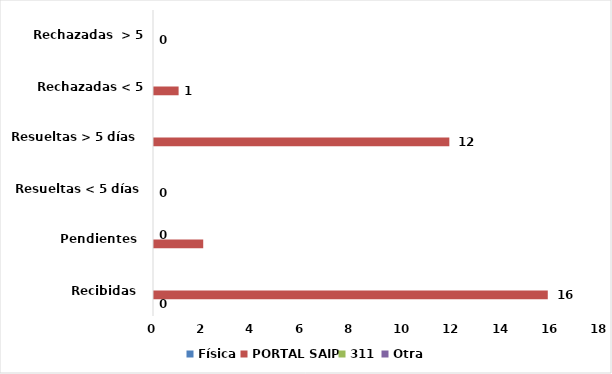
| Category | Física | PORTAL SAIP | 311 | Otra |
|---|---|---|---|---|
| Recibidas  | 0 | 16 | 0 | 0 |
| Pendientes  | 0 | 2 | 0 | 0 |
| Resueltas < 5 días | 0 | 0 | 0 | 0 |
| Resueltas > 5 días  | 0 | 12 | 0 | 0 |
| Rechazadas < 5 días  | 0 | 1 | 0 | 0 |
| Rechazadas  > 5 días | 0 | 0 | 0 | 0 |